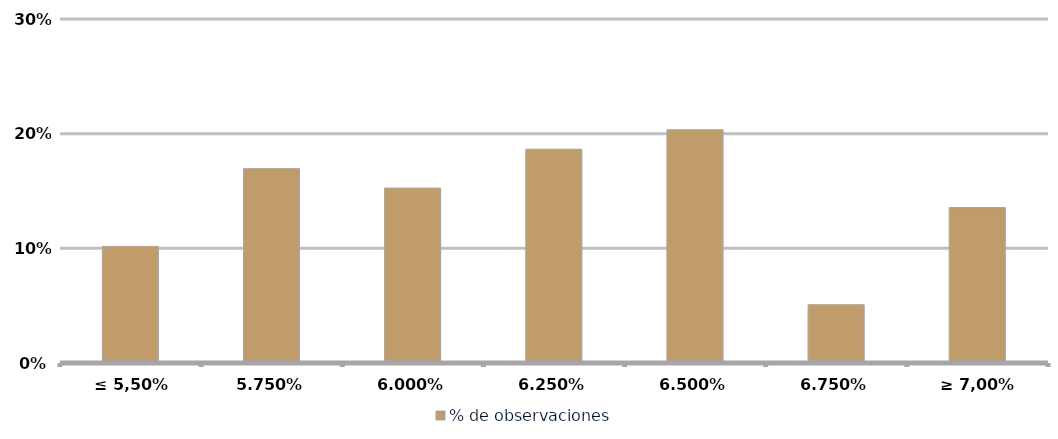
| Category | % de observaciones  |
|---|---|
| ≤ 5,50% | 0.102 |
| 5.75% | 0.169 |
| 6.00% | 0.153 |
| 6.25% | 0.186 |
| 6.50% | 0.203 |
| 6.75% | 0.051 |
| ≥ 7,00% | 0.136 |